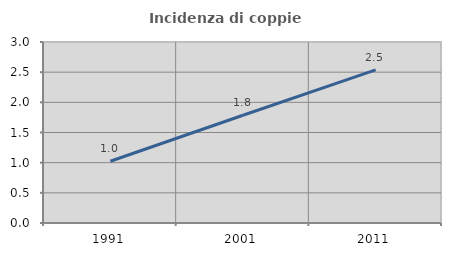
| Category | Incidenza di coppie miste |
|---|---|
| 1991.0 | 1.023 |
| 2001.0 | 1.786 |
| 2011.0 | 2.538 |